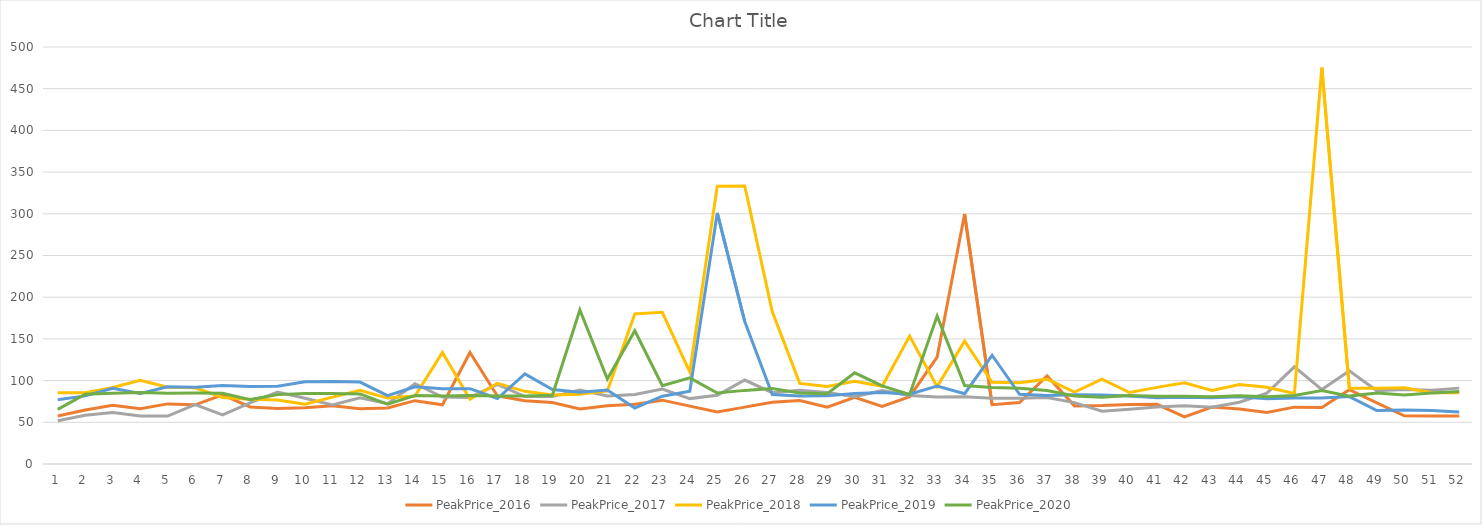
| Category | PeakPrice_2016 | PeakPrice_2017 | PeakPrice_2018 | PeakPrice_2019 | PeakPrice_2020 |
|---|---|---|---|---|---|
| 1.0 | 57.66 | 51.786 | 85.489 | 77.108 | 65.445 |
| 2.0 | 64.814 | 58.473 | 85.557 | 81.653 | 83.729 |
| 3.0 | 70.477 | 61.688 | 91.772 | 90.864 | 84.778 |
| 4.0 | 66.234 | 57.565 | 100.273 | 84.634 | 85.772 |
| 5.0 | 72.08 | 57.474 | 92.093 | 92.604 | 84.969 |
| 6.0 | 70.948 | 71.232 | 91.333 | 91.904 | 85.105 |
| 7.0 | 83.005 | 58.769 | 79.698 | 94.016 | 84.842 |
| 8.0 | 68.353 | 73.355 | 77.759 | 93.058 | 77.22 |
| 9.0 | 66.686 | 86.308 | 76.643 | 93.3 | 83.188 |
| 10.0 | 67.458 | 78.885 | 71.797 | 98.628 | 84.642 |
| 11.0 | 69.899 | 70.736 | 80.202 | 99.018 | 84.521 |
| 12.0 | 66.244 | 79.374 | 88.343 | 98.265 | 83.983 |
| 13.0 | 67.255 | 72.39 | 79.029 | 81.946 | 71.844 |
| 14.0 | 75.934 | 96.196 | 81.393 | 92.614 | 82.192 |
| 15.0 | 71.048 | 80.266 | 133.814 | 90.287 | 81.587 |
| 16.0 | 133.772 | 79.872 | 77.626 | 90.292 | 82.188 |
| 17.0 | 81.556 | 95.339 | 96.787 | 78.506 | 81.56 |
| 18.0 | 75.936 | 80.932 | 87.114 | 108.022 | 81.589 |
| 19.0 | 73.654 | 80.823 | 82.828 | 89.272 | 82.367 |
| 20.0 | 66.043 | 88.749 | 83.595 | 85.969 | 184.648 |
| 21.0 | 69.945 | 81.541 | 87.541 | 88.713 | 101.969 |
| 22.0 | 71.784 | 83.307 | 180.006 | 67.16 | 159.786 |
| 23.0 | 76.548 | 89.806 | 181.852 | 81.29 | 93.898 |
| 24.0 | 69.376 | 78.417 | 110.245 | 87.144 | 103.214 |
| 25.0 | 62.319 | 82.377 | 333.153 | 301.017 | 85.089 |
| 26.0 | 68.179 | 100.681 | 333.343 | 170.769 | 88.275 |
| 27.0 | 74.16 | 85.547 | 182.787 | 83.242 | 90.481 |
| 28.0 | 76.119 | 88.532 | 96.632 | 81.431 | 85.14 |
| 29.0 | 68.086 | 85.794 | 92.998 | 81.974 | 84.366 |
| 30.0 | 80.032 | 80.607 | 99.081 | 84.642 | 109.354 |
| 31.0 | 69.142 | 87.978 | 93.181 | 85.842 | 93.568 |
| 32.0 | 80.761 | 82.198 | 153.354 | 83.724 | 83.279 |
| 33.0 | 128.256 | 80.242 | 92.764 | 93.596 | 177.461 |
| 34.0 | 299.768 | 80.662 | 147.286 | 84.347 | 94.111 |
| 35.0 | 71.16 | 78.846 | 97.877 | 130.386 | 91.635 |
| 36.0 | 73.665 | 78.915 | 97.361 | 83.501 | 90.693 |
| 37.0 | 105.621 | 79.694 | 101.732 | 81.992 | 88.216 |
| 38.0 | 69.698 | 73.607 | 86.16 | 83.171 | 81.526 |
| 39.0 | 70.132 | 63.253 | 101.675 | 82.631 | 80.058 |
| 40.0 | 71.46 | 65.723 | 85.704 | 81.663 | 82.028 |
| 41.0 | 71.496 | 68.29 | 91.907 | 79.349 | 81.185 |
| 42.0 | 56.426 | 69.79 | 97.362 | 80.017 | 81.258 |
| 43.0 | 68.332 | 68.181 | 88.31 | 79.414 | 80.632 |
| 44.0 | 66.019 | 74.032 | 95.21 | 80.499 | 81.897 |
| 45.0 | 61.651 | 85.004 | 91.903 | 78.269 | 80.703 |
| 46.0 | 68.185 | 116.525 | 84.546 | 79.271 | 82.077 |
| 47.0 | 67.643 | 89.27 | 475.185 | 79.205 | 88.16 |
| 48.0 | 89.177 | 111.661 | 90.834 | 80.806 | 81.403 |
| 49.0 | 73.188 | 87.749 | 90.968 | 64.026 | 85.267 |
| 50.0 | 57.827 | 89.215 | 91.391 | 64.626 | 82.874 |
| 51.0 | 57.567 | 88.327 | 85.489 | 64.052 | 85.017 |
| 52.0 | 57.567 | 90.972 | 85.362 | 62.354 | 87.045 |